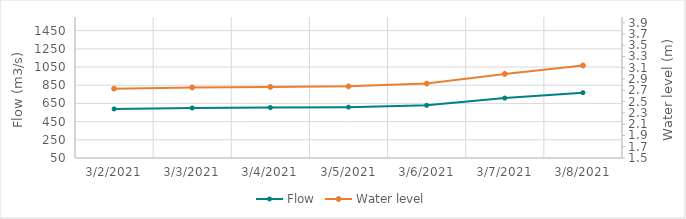
| Category | Flow |
|---|---|
| 2/18/21 | 580.92 |
| 2/17/21 | 647.89 |
| 2/16/21 | 736.23 |
| 2/15/21 | 815.31 |
| 2/14/21 | 893.25 |
| 2/13/21 | 941.5 |
| 2/12/21 | 970.2 |